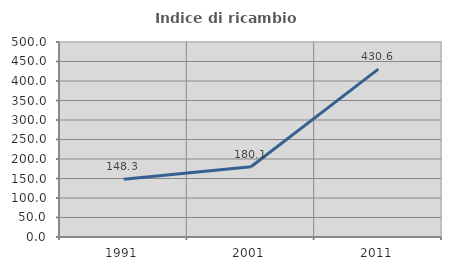
| Category | Indice di ricambio occupazionale  |
|---|---|
| 1991.0 | 148.345 |
| 2001.0 | 180.072 |
| 2011.0 | 430.556 |